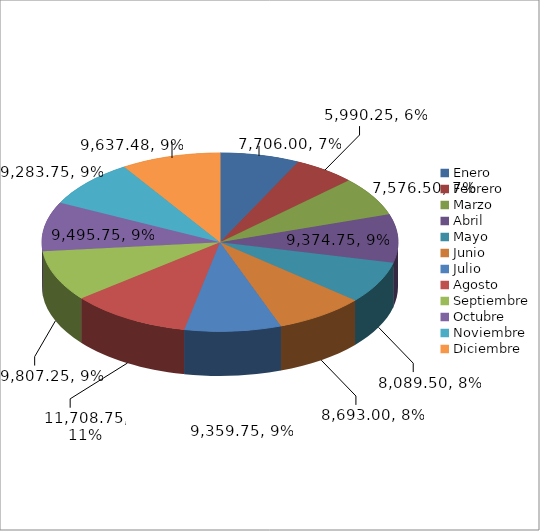
| Category | Año 2021 Valor $ | Año 2021 Toneladas |
|---|---|---|
| Enero | 7706 | 308.24 |
| Febrero | 5990.25 | 239.61 |
| Marzo | 7576.5 | 303.06 |
| Abril | 9374.75 | 374.99 |
| Mayo | 8089.5 | 323.58 |
| Junio | 8693 | 347.73 |
| Julio | 9359.75 | 374.39 |
| Agosto | 11708.75 | 468.35 |
| Septiembre | 9807.25 | 392.29 |
| Octubre | 9495.75 | 379.83 |
| Noviembre | 9283.75 | 371.35 |
| Diciembre | 9637.48 | 385.48 |